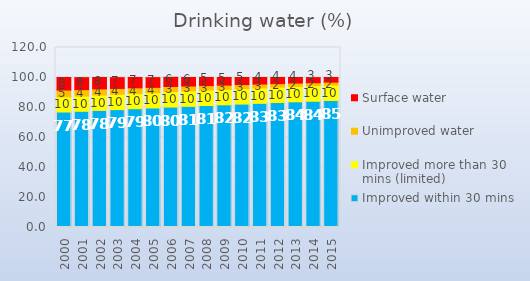
| Category | Improved within 30 mins | Improved more than 30 mins (limited) | Unimproved water | Surface water |
|---|---|---|---|---|
| 2000.0 | 77 | 10.1 | 4.5 | 8.4 |
| 2001.0 | 77.5 | 10.1 | 4.3 | 8 |
| 2002.0 | 78.1 | 10.2 | 4.1 | 7.6 |
| 2003.0 | 78.6 | 10.2 | 3.9 | 7.2 |
| 2004.0 | 79.2 | 10.2 | 3.7 | 6.9 |
| 2005.0 | 79.7 | 10.2 | 3.5 | 6.5 |
| 2006.0 | 80.3 | 10.3 | 3.4 | 6.1 |
| 2007.0 | 80.8 | 10.3 | 3.2 | 5.7 |
| 2008.0 | 81.3 | 10.3 | 3 | 5.4 |
| 2009.0 | 81.8 | 10.3 | 2.8 | 5.1 |
| 2010.0 | 82.3 | 10.3 | 2.7 | 4.7 |
| 2011.0 | 82.8 | 10.3 | 2.5 | 4.4 |
| 2012.0 | 83.3 | 10.3 | 2.3 | 4.1 |
| 2013.0 | 83.8 | 10.3 | 2.2 | 3.7 |
| 2014.0 | 84.2 | 10.3 | 2 | 3.4 |
| 2015.0 | 84.7 | 10.3 | 1.9 | 3.1 |